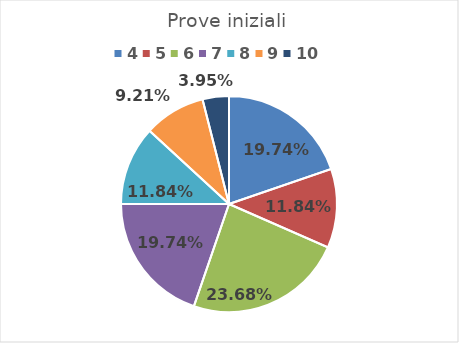
| Category | Series 0 |
|---|---|
| 4.0 | 0.197 |
| 5.0 | 0.118 |
| 6.0 | 0.237 |
| 7.0 | 0.197 |
| 8.0 | 0.118 |
| 9.0 | 0.092 |
| 10.0 | 0.039 |